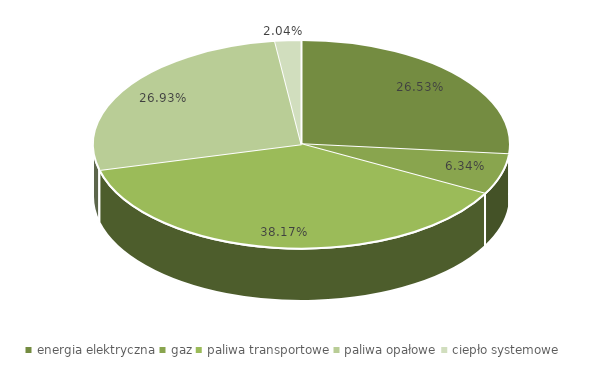
| Category | prognoza 2020 z inwestycjami oszczędnościowymi* |
|---|---|
| energia elektryczna | 0.265 |
| gaz | 0.063 |
| paliwa transportowe | 0.382 |
| paliwa opałowe | 0.269 |
| ciepło systemowe | 0.02 |